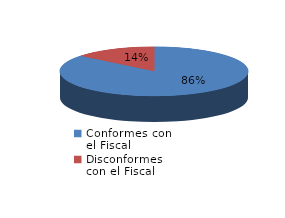
| Category | Series 0 |
|---|---|
| 0 | 213 |
| 1 | 35 |